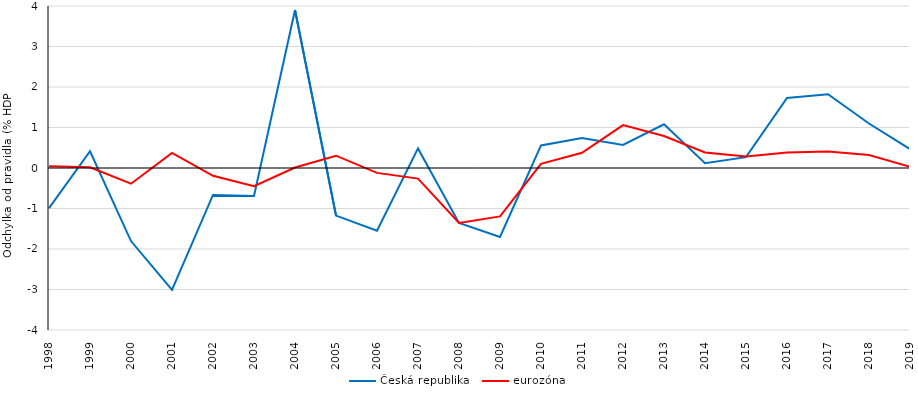
| Category | Česká republika | eurozóna |
|---|---|---|
| 1998.0 | -0.992 | 0.043 |
| 1999.0 | 0.414 | 0.019 |
| 2000.0 | -1.804 | -0.388 |
| 2001.0 | -3.008 | 0.375 |
| 2002.0 | -0.664 | -0.192 |
| 2003.0 | -0.692 | -0.451 |
| 2004.0 | 3.9 | 0.011 |
| 2005.0 | -1.175 | 0.304 |
| 2006.0 | -1.549 | -0.12 |
| 2007.0 | 0.483 | -0.262 |
| 2008.0 | -1.358 | -1.355 |
| 2009.0 | -1.704 | -1.195 |
| 2010.0 | 0.557 | 0.104 |
| 2011.0 | 0.74 | 0.376 |
| 2012.0 | 0.57 | 1.059 |
| 2013.0 | 1.08 | 0.789 |
| 2014.0 | 0.117 | 0.383 |
| 2015.0 | 0.267 | 0.286 |
| 2016.0 | 1.729 | 0.384 |
| 2017.0 | 1.823 | 0.409 |
| 2018.0 | 1.098 | 0.323 |
| 2019.0 | 0.465 | 0.029 |